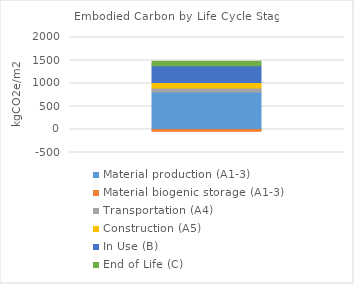
| Category | Material production (A1-3) | Material biogenic storage (A1-3) | Transportation (A4) | Construction (A5) | In Use (B) | End of Life (C) |
|---|---|---|---|---|---|---|
| kgCO2e/m2 | 815.989 | -38.878 | 87.934 | 119.603 | 360.11 | 101.639 |